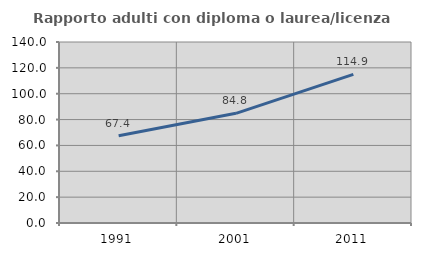
| Category | Rapporto adulti con diploma o laurea/licenza media  |
|---|---|
| 1991.0 | 67.442 |
| 2001.0 | 84.848 |
| 2011.0 | 114.935 |